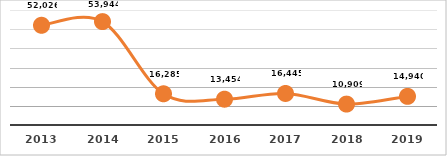
| Category | PERSONAS CAPACITADAS |
|---|---|
| 2013.0 | 52026 |
| 2014.0 | 53944 |
| 2015.0 | 16285 |
| 2016.0 | 13454 |
| 2017.0 | 16445 |
| 2018.0 | 10909 |
| 2019.0 | 14940 |